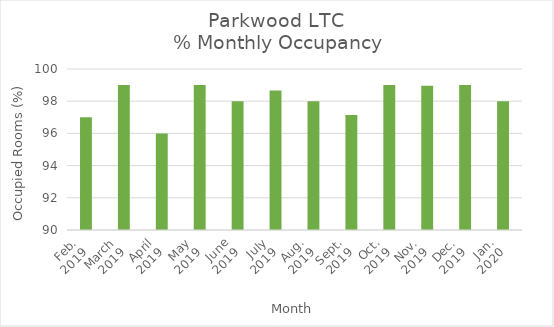
| Category | % Monthly Occupancy |
|---|---|
| Feb.
2019 | 97 |
| March
2019 | 99 |
| April
2019 | 96 |
| May
2019 | 99 |
| June
2019 | 98 |
| July
2019 | 98.66 |
| Aug.
2019 | 98 |
| Sept.
2019 | 97.15 |
| Oct.
2019 | 99 |
| Nov.
2019 | 98.96 |
| Dec.
2019 | 99 |
| Jan.
2020 | 98 |